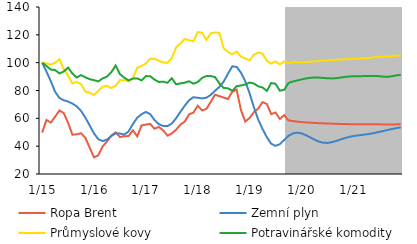
| Category | Ropa Brent | Zemní plyn | Průmyslové kovy | Potravinářské komodity |
|---|---|---|---|---|
|  1/15 | 49.758 | 100 | 100 | 100 |
| 2 | 58.795 | 93.587 | 99.447 | 97.61 |
| 3 | 56.939 | 86.683 | 98.694 | 95.043 |
| 4 | 61.136 | 79.043 | 99.91 | 94.708 |
| 5 | 65.609 | 74.666 | 102.513 | 92.252 |
| 6 | 63.753 | 72.949 | 95.306 | 93.666 |
| 7 | 56.764 | 72.072 | 90.716 | 96.445 |
| 8 | 48.206 | 70.601 | 85.084 | 92.155 |
| 9 | 48.54 | 68.591 | 86.115 | 89.356 |
| 10 | 49.293 | 65.314 | 84.587 | 91.06 |
| 11 | 45.932 | 60.5 | 79.258 | 89.434 |
| 12 | 38.904 | 54.867 | 78.434 | 88.105 |
|  1/16 | 31.926 | 49.108 | 76.848 | 87.452 |
| 2 | 33.527 | 45.013 | 79.703 | 86.547 |
| 3 | 39.79 | 43.643 | 82.693 | 88.65 |
| 4 | 43.34 | 44.699 | 83.376 | 89.984 |
| 5 | 47.647 | 47.228 | 81.811 | 93.168 |
| 6 | 49.927 | 49.233 | 83.481 | 97.947 |
| 7 | 46.535 | 49.096 | 87.466 | 91.753 |
| 8 | 47.159 | 48.301 | 87.425 | 89.188 |
| 9 | 47.24 | 50.589 | 86.545 | 87.268 |
| 10 | 51.388 | 55.926 | 88.712 | 88.629 |
| 11 | 47.079 | 60.421 | 96.355 | 88.705 |
| 12 | 54.916 | 62.973 | 97.676 | 87.26 |
|  1/17 | 55.51 | 64.621 | 99.349 | 90.348 |
| 2 | 55.997 | 63.025 | 102.876 | 90.261 |
| 3 | 52.539 | 58.736 | 102.739 | 87.811 |
| 4 | 53.819 | 55.798 | 101.399 | 86.112 |
| 5 | 51.39 | 54.498 | 100.169 | 86.362 |
| 6 | 47.554 | 54.411 | 99.885 | 85.51 |
| 7 | 49.149 | 56.249 | 103.485 | 88.802 |
| 8 | 51.87 | 60.081 | 110.967 | 84.404 |
| 9 | 55.515 | 64.703 | 113.902 | 85.12 |
| 10 | 57.649 | 69.083 | 116.948 | 85.594 |
| 11 | 62.866 | 73.02 | 116.113 | 86.634 |
| 12 | 64.092 | 75.179 | 115.333 | 84.884 |
|  1/18 | 69.079 | 74.765 | 121.995 | 86.058 |
| 2 | 65.73 | 74.31 | 121.52 | 88.987 |
| 3 | 66.72 | 74.807 | 116.383 | 90.396 |
| 4 | 71.762 | 76.83 | 121.053 | 90.402 |
| 5 | 77.007 | 79.814 | 121.699 | 89.631 |
| 6 | 75.941 | 82.558 | 121.455 | 85.084 |
| 7 | 74.952 | 86.406 | 110.296 | 81.836 |
| 8 | 73.842 | 92.054 | 107.709 | 81.576 |
| 9 | 79.11 | 97.36 | 106.075 | 79.731 |
| 10 | 80.63 | 96.966 | 107.898 | 83.137 |
| 11 | 65.949 | 92.832 | 104.332 | 83.564 |
| 12 | 57.674 | 86.598 | 103 | 84.318 |
|  1/19 | 60.241 | 78.003 | 101.636 | 85.695 |
| 2 | 64.432 | 67.93 | 105.768 | 85.01 |
| 3 | 67.028 | 59.087 | 107.286 | 83.005 |
| 4 | 71.629 | 52.329 | 106.481 | 82.161 |
| 5 | 70.303 | 46.382 | 101.269 | 79.693 |
| 6 | 63.038 | 41.74 | 99.317 | 85.393 |
| 7 | 64.215 | 40.234 | 100.899 | 84.823 |
| 8 | 59.502 | 41.429 | 98.74 | 79.868 |
| 9 | 62.287 | 44.457 | 100.796 | 80.494 |
| 10 | 58.503 | 47.369 | 99.895 | 85.391 |
| 11 | 58.102 | 49.187 | 100.215 | 86.462 |
| 12 | 57.631 | 49.743 | 100.253 | 87.187 |
|  1/20 | 57.305 | 49.221 | 100.173 | 87.946 |
| 2 | 57.074 | 47.958 | 100.412 | 88.608 |
| 3 | 56.877 | 46.358 | 100.687 | 89.106 |
| 4 | 56.696 | 44.713 | 100.926 | 89.355 |
| 5 | 56.532 | 43.305 | 101.196 | 89.281 |
| 6 | 56.41 | 42.489 | 101.413 | 89.026 |
| 7 | 56.292 | 42.326 | 101.623 | 88.797 |
| 8 | 56.17 | 42.812 | 101.858 | 88.67 |
| 9 | 56.06 | 43.684 | 102.056 | 88.829 |
| 10 | 55.946 | 44.733 | 102.259 | 89.247 |
| 11 | 55.883 | 45.755 | 102.439 | 89.714 |
| 12 | 55.831 | 46.608 | 102.602 | 90.065 |
|  1/21 | 55.793 | 47.245 | 102.733 | 90.231 |
| 2 | 55.765 | 47.706 | 102.92 | 90.294 |
| 3 | 55.739 | 48.085 | 103.118 | 90.322 |
| 4 | 55.712 | 48.482 | 103.329 | 90.369 |
| 5 | 55.69 | 48.963 | 103.557 | 90.378 |
| 6 | 55.673 | 49.552 | 103.96 | 90.37 |
| 7 | 55.659 | 50.231 | 104.18 | 90.309 |
| 8 | 55.651 | 50.962 | 104.357 | 89.924 |
| 9 | 55.644 | 51.694 | 104.539 | 89.806 |
| 10 | 55.64 | 52.381 | 104.749 | 90.272 |
| 11 | 55.661 | 52.991 | 105.005 | 90.894 |
| 12 | 55.688 | 53.517 | 105.276 | 91.301 |